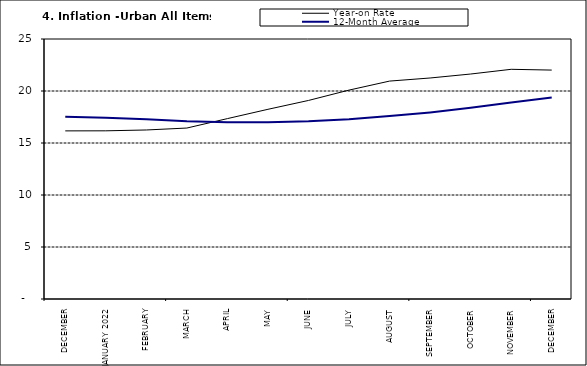
| Category | Year-on Rate | 12-Month Average |
|---|---|---|
| DECEMBER | 16.165 | 17.519 |
| JANUARY 2022 | 16.171 | 17.435 |
| FEBRUARY | 16.253 | 17.292 |
| MARCH | 16.438 | 17.103 |
| APRIL | 17.347 | 17.005 |
| MAY | 18.24 | 17.002 |
| JUNE | 19.093 | 17.087 |
| JULY | 20.087 | 17.285 |
| AUGUST | 20.954 | 17.588 |
| SEPTEMBER | 21.251 | 17.944 |
| OCTOBER | 21.632 | 18.379 |
| NOVEMBER | 22.086 | 18.896 |
| DECEMBER | 22.011 | 19.382 |